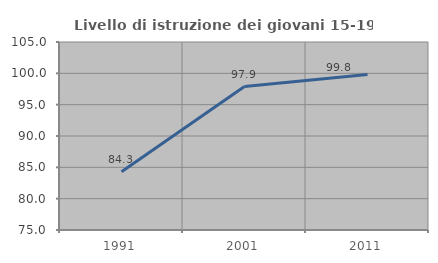
| Category | Livello di istruzione dei giovani 15-19 anni |
|---|---|
| 1991.0 | 84.281 |
| 2001.0 | 97.896 |
| 2011.0 | 99.811 |